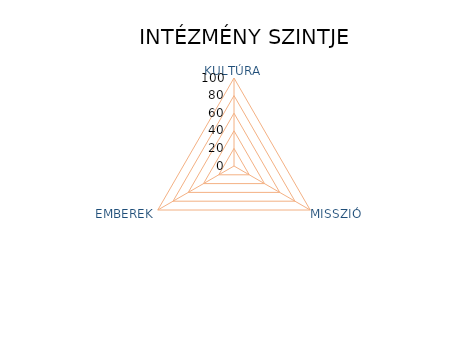
| Category | "Dimensions" |
|---|---|
| KULTÚRA | 0 |
| MISSZIÓ | 0 |
| EMBEREK | 0 |